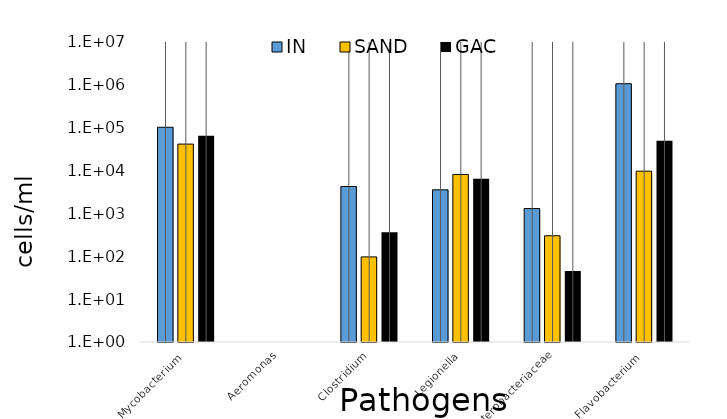
| Category | IN | SAND | GAC |
|---|---|---|---|
| Mycobacterium  | 102512.228 | 41495.171 | 65099.59 |
| Aeromonas | 0 | 0 | 0 |
| Clostridium | 4248.947 | 96.778 | 366.118 |
| Legionella  | 3554.091 | 8086.323 | 6424.961 |
| Enterobacteriaceae | 1299.574 | 301.279 | 45.597 |
| Flavobacterium  | 1062465.496 | 9679.984 | 49846.301 |